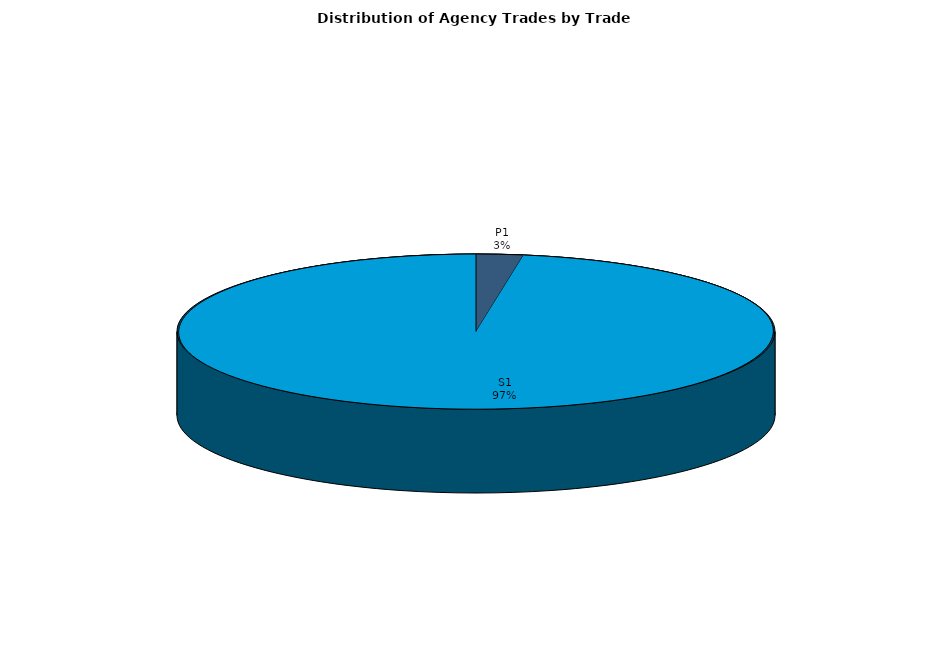
| Category | Series 0 |
|---|---|
| P1 | 64.952 |
| S1 | 2487.913 |